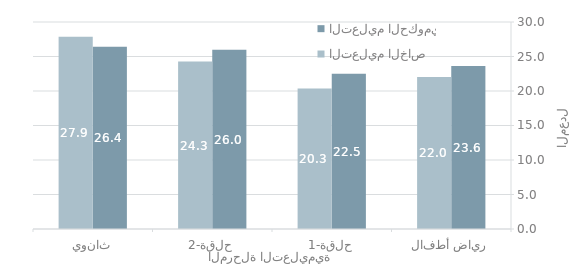
| Category | التعليم الحكومي | التعليم الخاص |
|---|---|---|
| رياض أطفال | 23.624 | 22.037 |
| حلقة-1 | 22.505 | 20.346 |
| حلقة-2 | 25.98 | 24.259 |
| ثانوي | 26.397 | 27.855 |